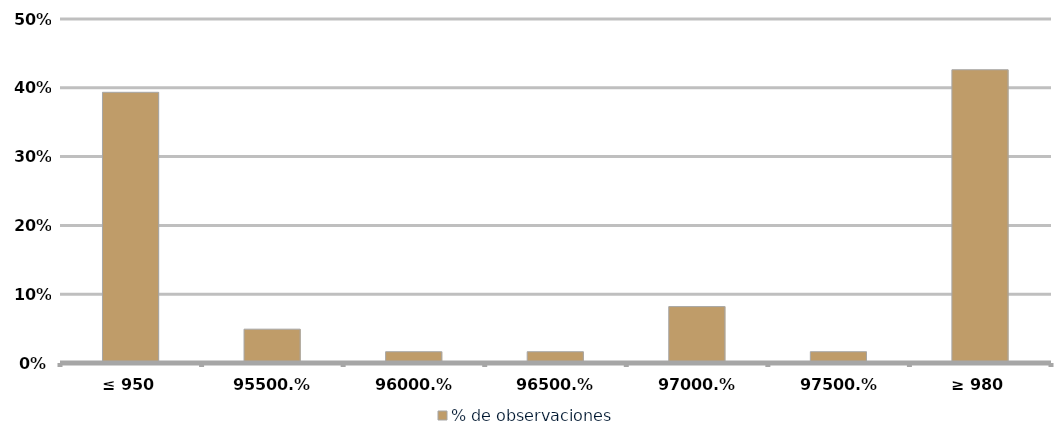
| Category | % de observaciones  |
|---|---|
| ≤ 950 | 0.393 |
| 955 | 0.049 |
| 960 | 0.016 |
| 965 | 0.016 |
| 970 | 0.082 |
| 975 | 0.016 |
| ≥ 980 | 0.426 |